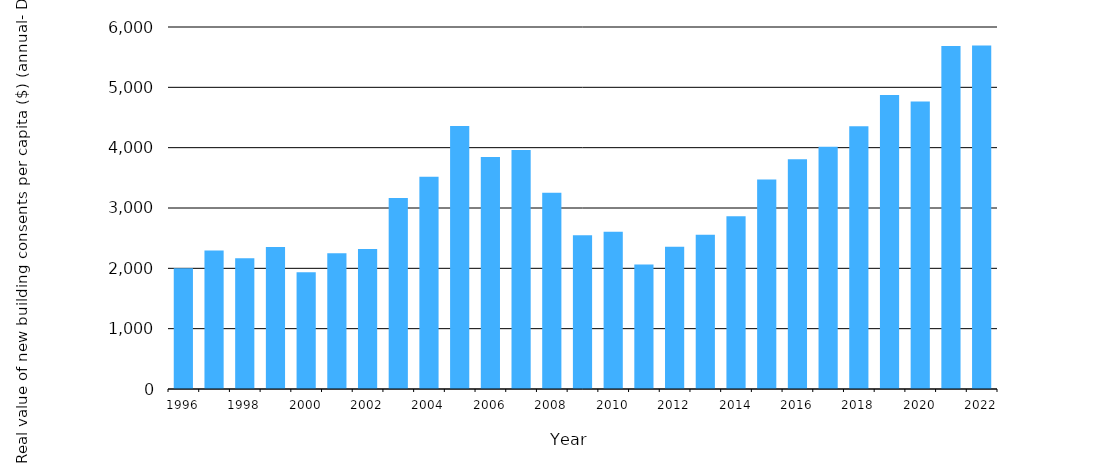
| Category | Real value of new building consents authorised per capita ($) (annual - Dec) |
|---|---|
| 1996.0 | 2003.316 |
| 1997.0 | 2296.696 |
| 1998.0 | 2167.444 |
| 1999.0 | 2354.856 |
| 2000.0 | 1934.601 |
| 2001.0 | 2251.245 |
| 2002.0 | 2322.144 |
| 2003.0 | 3164.107 |
| 2004.0 | 3516.269 |
| 2005.0 | 4359.076 |
| 2006.0 | 3844.167 |
| 2007.0 | 3962.728 |
| 2008.0 | 3252.34 |
| 2009.0 | 2548.033 |
| 2010.0 | 2605.837 |
| 2011.0 | 2064.239 |
| 2012.0 | 2358.628 |
| 2013.0 | 2557.855 |
| 2014.0 | 2863.597 |
| 2015.0 | 3470.876 |
| 2016.0 | 3808.882 |
| 2017.0 | 4014.658 |
| 2018.0 | 4353.561 |
| 2019.0 | 4872.273 |
| 2020.0 | 4764.435 |
| 2021.0 | 5685.474 |
| 2022.0 | 5695.269 |